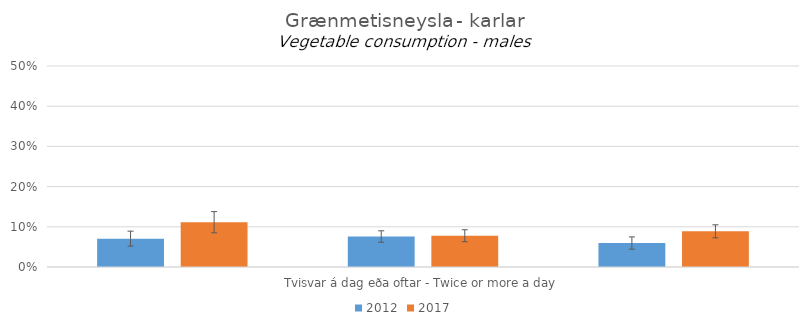
| Category | 2012 | 2017 |
|---|---|---|
| 0 | 0.071 | 0.111 |
| 1 | 0.076 | 0.078 |
| 2 | 0.06 | 0.089 |